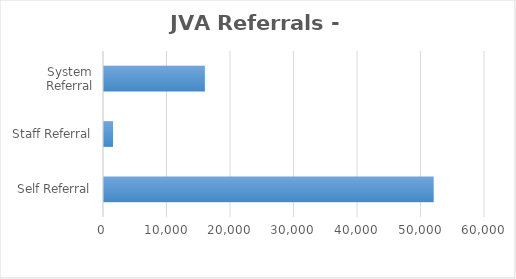
| Category | Series 0 |
|---|---|
| Self Referral | 51921 |
| Staff Referral | 1422 |
| System Referral | 15887 |